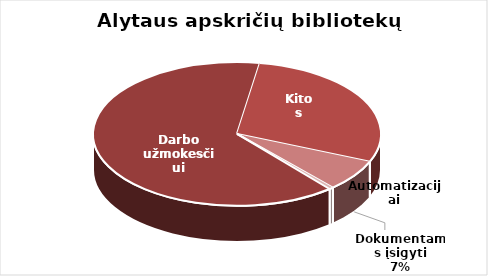
| Category | Series 0 |
|---|---|
| Darbo užmokesčiui | 1627827.99 |
| Kitos | 735794.96 |
| Dokumentams įsigyti | 181635.34 |
| Automatizacijai | 12040 |